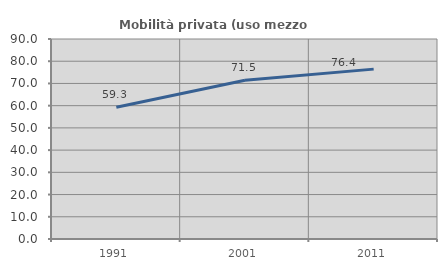
| Category | Mobilità privata (uso mezzo privato) |
|---|---|
| 1991.0 | 59.316 |
| 2001.0 | 71.468 |
| 2011.0 | 76.443 |